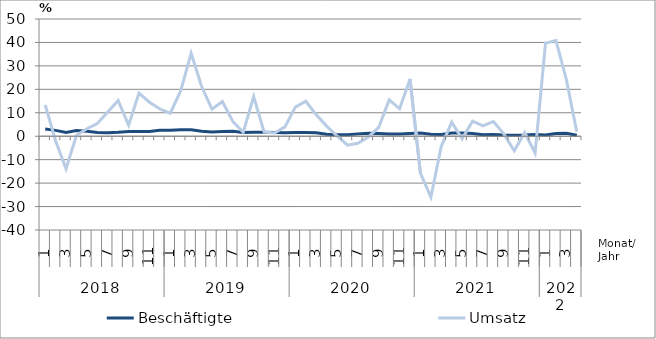
| Category | Beschäftigte | Umsatz |
|---|---|---|
| 0 | 3.1 | 13.3 |
| 1 | 2.5 | -2 |
| 2 | 1.6 | -13.9 |
| 3 | 2.4 | 0.4 |
| 4 | 2.1 | 3.2 |
| 5 | 1.6 | 5.4 |
| 6 | 1.5 | 10.3 |
| 7 | 1.7 | 15.2 |
| 8 | 2 | 4.7 |
| 9 | 2 | 18.4 |
| 10 | 2 | 14.5 |
| 11 | 2.5 | 11.6 |
| 12 | 2.6 | 9.8 |
| 13 | 2.8 | 19.4 |
| 14 | 2.8 | 35.4 |
| 15 | 2.1 | 21.3 |
| 16 | 1.8 | 11.5 |
| 17 | 2 | 14.8 |
| 18 | 2.1 | 6.3 |
| 19 | 1.6 | 1.7 |
| 20 | 1.7 | 16.9 |
| 21 | 1.7 | 1.8 |
| 22 | 1.6 | 1.4 |
| 23 | 1.5 | 4 |
| 24 | 1.6 | 12.4 |
| 25 | 1.6 | 14.9 |
| 26 | 1.5 | 9.1 |
| 27 | 0.8 | 4.3 |
| 28 | 0.6 | 0.1 |
| 29 | 0.6 | -3.8 |
| 30 | 1 | -3 |
| 31 | 1.3 | -0.4 |
| 32 | 1.2 | 3.8 |
| 33 | 1 | 15.5 |
| 34 | 1 | 11.7 |
| 35 | 1.2 | 24.4 |
| 36 | 1.4 | -15.8 |
| 37 | 0.8 | -26 |
| 38 | 0.7 | -4.3 |
| 39 | 1.4 | 6 |
| 40 | 1.4 | -1.1 |
| 41 | 1.2 | 6.4 |
| 42 | 0.6 | 4.4 |
| 43 | 0.7 | 6.3 |
| 44 | 0.5 | 1 |
| 45 | 0.4 | -6.2 |
| 46 | 0.5 | 1.6 |
| 47 | 0.7 | -7.1 |
| 48 | 0.5 | 39.7 |
| 49 | 1.2 | 40.8 |
| 50 | 1.3 | 24.2 |
| 51 | 0.4 | 1.9 |